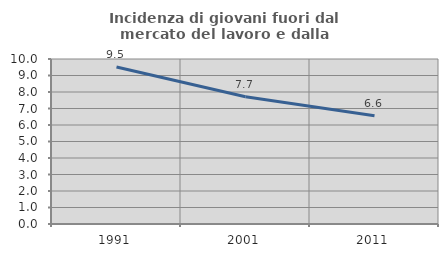
| Category | Incidenza di giovani fuori dal mercato del lavoro e dalla formazione  |
|---|---|
| 1991.0 | 9.518 |
| 2001.0 | 7.715 |
| 2011.0 | 6.555 |